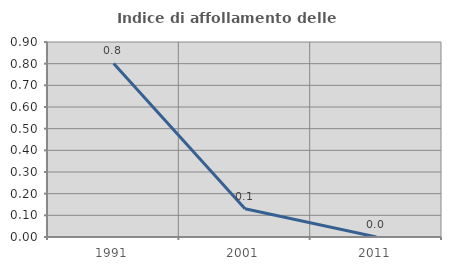
| Category | Indice di affollamento delle abitazioni  |
|---|---|
| 1991.0 | 0.801 |
| 2001.0 | 0.13 |
| 2011.0 | 0 |